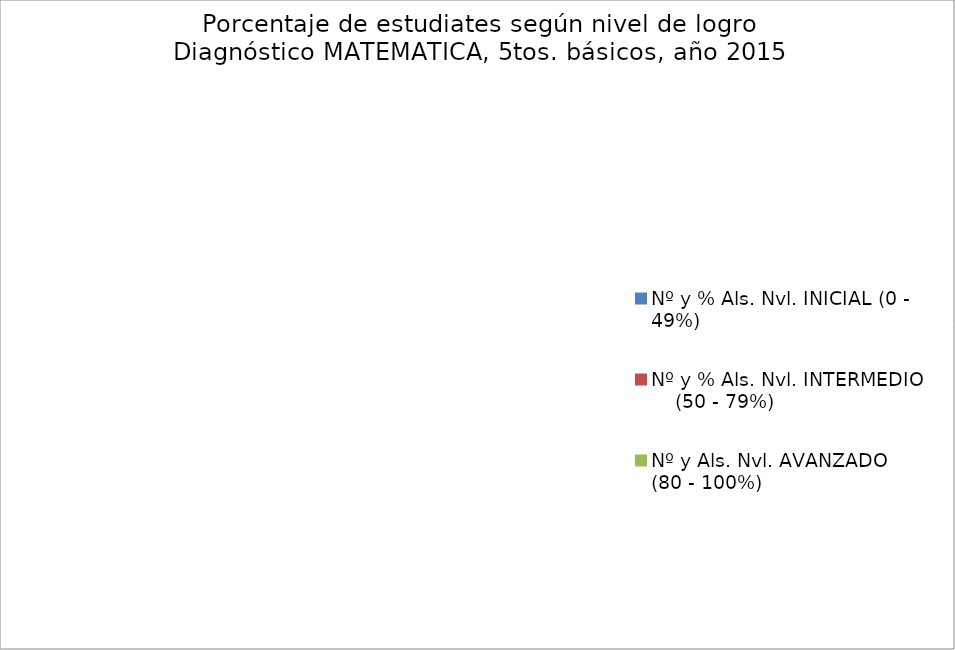
| Category | Series 0 |
|---|---|
| Nº y % Als. Nvl. INICIAL (0 - 49%) | 0 |
| Nº y % Als. Nvl. INTERMEDIO           (50 - 79%) | 0 |
| Nº y Als. Nvl. AVANZADO           (80 - 100%) | 0 |